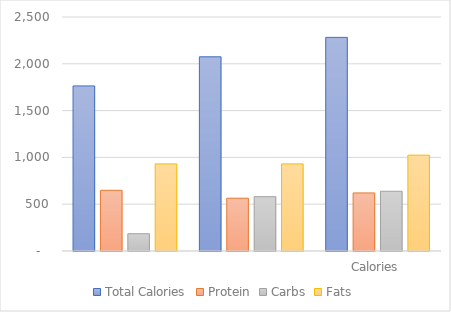
| Category | Total Calories | Protein | Carbs | Fats |
|---|---|---|---|---|
| 0 | 1763.58 | 648.6 | 184.38 | 930.6 |
| 1 | 2074.8 | 564 | 580.2 | 930.6 |
| 2 | 2282.28 | 620.4 | 638.22 | 1023.66 |